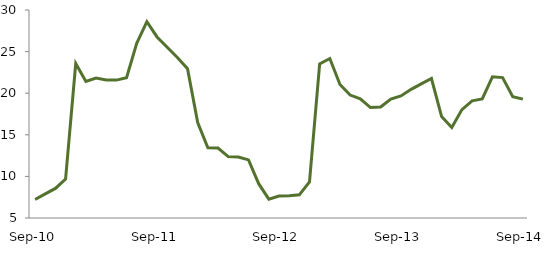
| Category | Series 0 |
|---|---|
| Sep-10 | 7.221 |
|  | 7.895 |
|  | 8.557 |
|  | 9.672 |
|  | 23.568 |
|  | 21.416 |
|  | 21.82 |
|  | 21.594 |
|  | 21.573 |
|  | 21.858 |
|  | 26.004 |
|  | 28.598 |
| Sep-11 | 26.763 |
|  | 25.524 |
|  | 24.297 |
|  | 22.953 |
|  | 16.468 |
|  | 13.439 |
|  | 13.403 |
|  | 12.375 |
|  | 12.322 |
|  | 11.984 |
|  | 9.127 |
|  | 7.263 |
| Sep-12 | 7.639 |
|  | 7.67 |
|  | 7.782 |
|  | 9.348 |
|  | 23.527 |
|  | 24.167 |
|  | 21.04 |
|  | 19.779 |
|  | 19.32 |
|  | 18.279 |
|  | 18.336 |
|  | 19.291 |
| Sep-13 | 19.663 |
|  | 20.461 |
|  | 21.118 |
|  | 21.766 |
|  | 17.185 |
|  | 15.873 |
|  | 18.029 |
|  | 19.087 |
|  | 19.316 |
|  | 21.967 |
|  | 21.875 |
|  | 19.587 |
| Sep-14 | 19.284 |